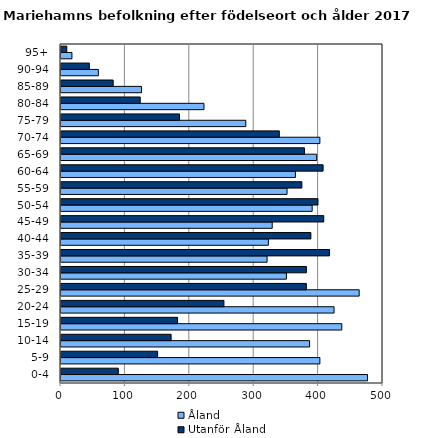
| Category | Åland | Utanför Åland |
|---|---|---|
| 0-4 | 476 | 89 |
| 5-9 | 402 | 150 |
| 10-14 | 386 | 171 |
| 15-19 | 436 | 181 |
| 20-24 | 424 | 253 |
| 25-29 | 463 | 381 |
| 30-34 | 350 | 381 |
| 35-39 | 320 | 417 |
| 40-44 | 322 | 388 |
| 45-49 | 328 | 408 |
| 50-54 | 390 | 399 |
| 55-59 | 351 | 374 |
| 60-64 | 364 | 407 |
| 65-69 | 397 | 378 |
| 70-74 | 402 | 339 |
| 75-79 | 287 | 184 |
| 80-84 | 222 | 123 |
| 85-89 | 125 | 81 |
| 90-94 | 58 | 44 |
| 95+ | 17 | 9 |